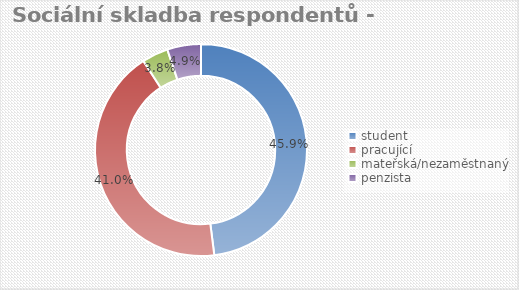
| Category | Series 0 |
|---|---|
| student | 0.459 |
| pracující | 0.41 |
| mateřská/nezaměstnaný | 0.038 |
| penzista | 0.049 |